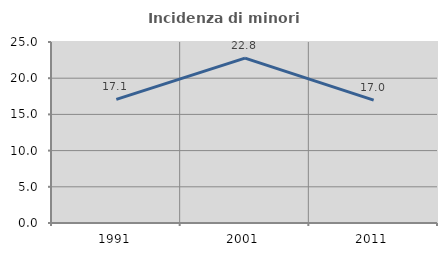
| Category | Incidenza di minori stranieri |
|---|---|
| 1991.0 | 17.073 |
| 2001.0 | 22.778 |
| 2011.0 | 16.972 |